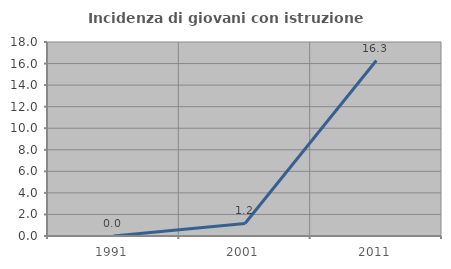
| Category | Incidenza di giovani con istruzione universitaria |
|---|---|
| 1991.0 | 0 |
| 2001.0 | 1.163 |
| 2011.0 | 16.279 |